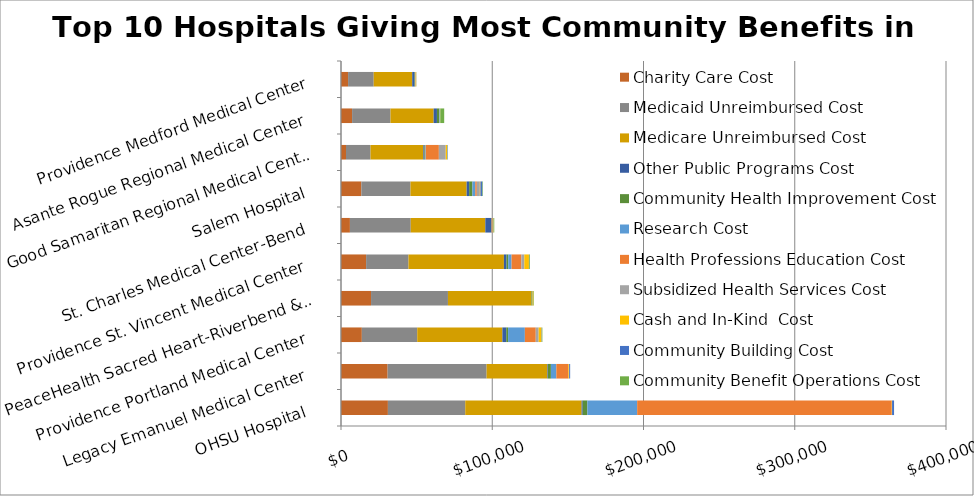
| Category | Charity Care Cost | Medicaid Unreimbursed Cost | Medicare Unreimbursed Cost | Other Public Programs Cost | Community Health Improvement Cost | Research Cost | Health Professions Education Cost | Subsidized Health Services Cost | Cash and In-Kind  Cost | Community Building Cost | Community Benefit Operations Cost |
|---|---|---|---|---|---|---|---|---|---|---|---|
| OHSU Hospital | 31015838 | 51133348 | 76942252 | 714600 | 3081563 | 32921133 | 168310304 | 0 | 221336 | 1303714 | 9588 |
| Legacy Emanuel Medical Center | 30831175 | 65433082 | 40206239 | 378484 | 1924517 | 3590778 | 7994424 | 0 | 487882 | 655342 | 0 |
| Providence Portland Medical Center | 13781229 | 36617365 | 56314068 | 2545491 | 1212933 | 11094747 | 7198590 | 1922868 | 1903122 | 205387 | 338916 |
| PeaceHealth Sacred Heart-Riverbend & University  | 19859421 | 50853787 | 55203027 | 0 | 697222 | 0 | 90283 | 46358 | 535358 | 0 | 300221 |
| Providence St. Vincent Medical Center | 16603460 | 28000905 | 63107767 | 1710995 | 1155920 | 2194958 | 6482063 | 1933229 | 3067375 | 239216 | 457199 |
| St. Charles Medical Center-Bend | 5900372 | 40214408 | 49301536 | 4052143 | 146553 | 0 | 503576 | 259672 | 402864 | 127752 | 422941 |
| Salem Hospital | 13464253 | 32483503 | 37132763 | 1623542 | 2182058 | 1901005 | 991747 | 2020855 | 402810 | 1288187 | 338680 |
| Good Samaritan Regional Medical Center | 3289527 | 16233989 | 34926031 | 772387 | 423954 | 362040 | 8699891 | 4527282 | 950508 | 293894 | 106835 |
| Asante Rogue Regional Medical Center | 7332577 | 25391925 | 28531231 | 2172367 | 1626534 | 231518 | 4165 | 191620 | 154682 | 11821 | 2579217 |
| Providence Medford Medical Center | 4677839 | 16954212 | 25454215 | 1580890 | 342455 | 103392 | 203752 | 41368 | 368857 | 69340 | 59092 |